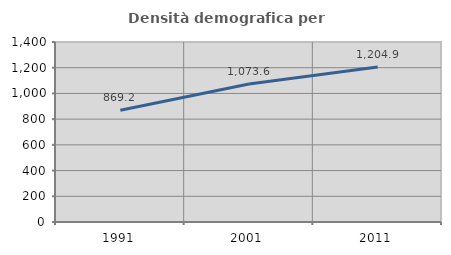
| Category | Densità demografica |
|---|---|
| 1991.0 | 869.222 |
| 2001.0 | 1073.639 |
| 2011.0 | 1204.87 |